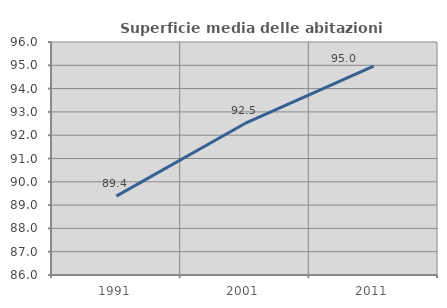
| Category | Superficie media delle abitazioni occupate |
|---|---|
| 1991.0 | 89.384 |
| 2001.0 | 92.505 |
| 2011.0 | 94.961 |